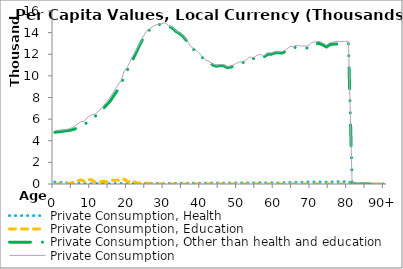
| Category | Private Consumption, Health | Private Consumption, Education | Private Consumption, Other than health and education | Private Consumption |
|---|---|---|---|---|
| 0 | 177.847 | 0 | 4780.067 | 4957.914 |
|  | 146.741 | 0 | 4824.711 | 4971.451 |
| 2 | 128.253 | 2.304 | 4869.354 | 4999.911 |
| 3 | 109.766 | 9.38 | 4913.998 | 5033.144 |
| 4 | 91.279 | 63.389 | 4958.642 | 5113.31 |
| 5 | 73.492 | 147.422 | 5037.211 | 5258.125 |
| 6 | 59.317 | 250.166 | 5161.443 | 5470.927 |
| 7 | 49.447 | 396.019 | 5291.558 | 5737.025 |
| 8 | 40.308 | 249.626 | 5508.85 | 5798.784 |
| 9 | 35.042 | 419.644 | 5734.123 | 6188.809 |
| 10 | 36.57 | 390.712 | 5981.323 | 6408.605 |
| 11 | 38.458 | 163.626 | 6264.904 | 6466.989 |
| 12 | 38.061 | 169.052 | 6529.791 | 6736.904 |
| 13 | 36.051 | 243.806 | 6878.691 | 7158.547 |
| 14 | 37.081 | 215.01 | 7273.089 | 7525.18 |
| 15 | 40.498 | 323.114 | 7625.29 | 7988.902 |
| 16 | 42.226 | 343.138 | 8141.28 | 8526.643 |
| 17 | 44.287 | 367.303 | 8641.105 | 9052.694 |
| 18 | 47.604 | 263.441 | 9239.753 | 9550.798 |
| 19 | 49.087 | 436.491 | 10017.057 | 10502.634 |
| 20 | 50.117 | 190.18 | 10710.141 | 10950.438 |
| 21 | 53.486 | 320.984 | 11342.29 | 11716.76 |
| 22 | 55.679 | 131.631 | 12050.232 | 12237.542 |
| 23 | 57.387 | 84.185 | 12766.493 | 12908.065 |
| 24 | 55.771 | 81.782 | 13451.519 | 13589.071 |
| 25 | 55.556 | 89.212 | 14025.482 | 14170.249 |
| 26 | 55.863 | 20.413 | 14316.931 | 14393.207 |
| 27 | 55.714 | 0 | 14583.306 | 14639.02 |
| 28 | 55.057 | 0 | 14728.928 | 14783.985 |
| 29 | 54.628 | 0 | 14764.944 | 14819.573 |
| 30 | 54.754 | 0 | 14840.52 | 14895.274 |
| 31 | 60.234 | 0 | 14606.667 | 14666.901 |
| 32 | 61.029 | 0 | 14432.931 | 14493.96 |
| 33 | 64.897 | 0 | 14100.937 | 14165.834 |
| 34 | 70.084 | 0 | 13917.63 | 13987.715 |
| 35 | 71.554 | 0 | 13617.586 | 13689.139 |
| 36 | 73.661 | 0 | 13199.553 | 13273.214 |
| 37 | 76.774 | 0 | 12630.4 | 12707.174 |
| 38 | 80.791 | 0 | 12413.458 | 12494.249 |
| 39 | 82.092 | 0 | 12138.589 | 12220.681 |
| 40 | 82.769 | 0 | 11774.635 | 11857.404 |
| 41 | 83.243 | 0 | 11392.583 | 11475.826 |
| 42 | 92.231 | 0 | 11243.725 | 11335.956 |
| 43 | 94.995 | 0 | 11015.999 | 11110.994 |
| 44 | 95.204 | 0 | 10891.529 | 10986.732 |
| 45 | 95.117 | 0 | 10949.092 | 11044.209 |
| 46 | 89.077 | 0 | 10940.223 | 11029.301 |
| 47 | 83.981 | 0 | 10763.492 | 10847.474 |
| 48 | 106.747 | 0 | 10814.785 | 10921.532 |
| 49 | 109.795 | 0 | 10953.246 | 11063.041 |
| 50 | 110.296 | 0 | 11149.244 | 11259.54 |
| 51 | 104.806 | 0 | 11207.012 | 11311.818 |
| 52 | 105.067 | 0 | 11319.203 | 11424.27 |
| 53 | 108.923 | 0 | 11639.452 | 11748.375 |
| 54 | 104.581 | 0 | 11574.165 | 11678.746 |
| 55 | 115.54 | 0 | 11769.389 | 11884.929 |
| 56 | 127.287 | 0 | 11867.374 | 11994.662 |
| 57 | 96.091 | 0 | 11748.726 | 11844.816 |
| 58 | 112.903 | 0 | 12000.928 | 12113.831 |
| 59 | 118.784 | 0 | 12007.337 | 12126.122 |
| 60 | 110.097 | 0 | 12133.013 | 12243.109 |
| 61 | 108.045 | 0 | 12128.724 | 12236.769 |
| 62 | 126.299 | 0 | 12120.456 | 12246.756 |
| 63 | 134.104 | 0 | 12280.77 | 12414.874 |
| 64 | 139.404 | 0 | 12554.922 | 12694.326 |
| 65 | 152.875 | 0 | 12586.53 | 12739.404 |
| 66 | 155.565 | 0 | 12683.011 | 12838.576 |
| 67 | 138.92 | 0 | 12598.264 | 12737.184 |
| 68 | 167.608 | 0 | 12604.338 | 12771.946 |
| 69 | 185.986 | 0 | 12563.607 | 12749.594 |
| 70 | 191.772 | 0 | 12899.02 | 13090.792 |
| 71 | 178.992 | 0 | 12979.907 | 13158.899 |
| 72 | 185.372 | 0 | 13005.049 | 13190.42 |
| 73 | 182.728 | 0 | 12863.311 | 13046.039 |
| 74 | 166.361 | 0 | 12672.005 | 12838.366 |
| 75 | 165.589 | 0 | 12900.34 | 13065.929 |
| 76 | 217.716 | 0 | 12939.033 | 13156.748 |
| 77 | 215.907 | 0 | 12952.67 | 13168.577 |
| 78 | 214.099 | 0 | 12966.307 | 13180.405 |
| 79 | 212.29 | 0 | 12979.944 | 13192.234 |
| 80 | 210.481 | 0 | 12993.581 | 13204.062 |
| 81 | 0 | 0 | 0 | 0 |
| 82 | 0 | 0 | 0 | 0 |
| 83 | 0 | 0 | 0 | 0 |
| 84 | 0 | 0 | 0 | 0 |
| 85 | 0 | 0 | 0 | 0 |
| 86 | 0 | 0 | 0 | 0 |
| 87 | 0 | 0 | 0 | 0 |
| 88 | 0 | 0 | 0 | 0 |
| 89 | 0 | 0 | 0 | 0 |
| 90+ | 0 | 0 | 0 | 0 |